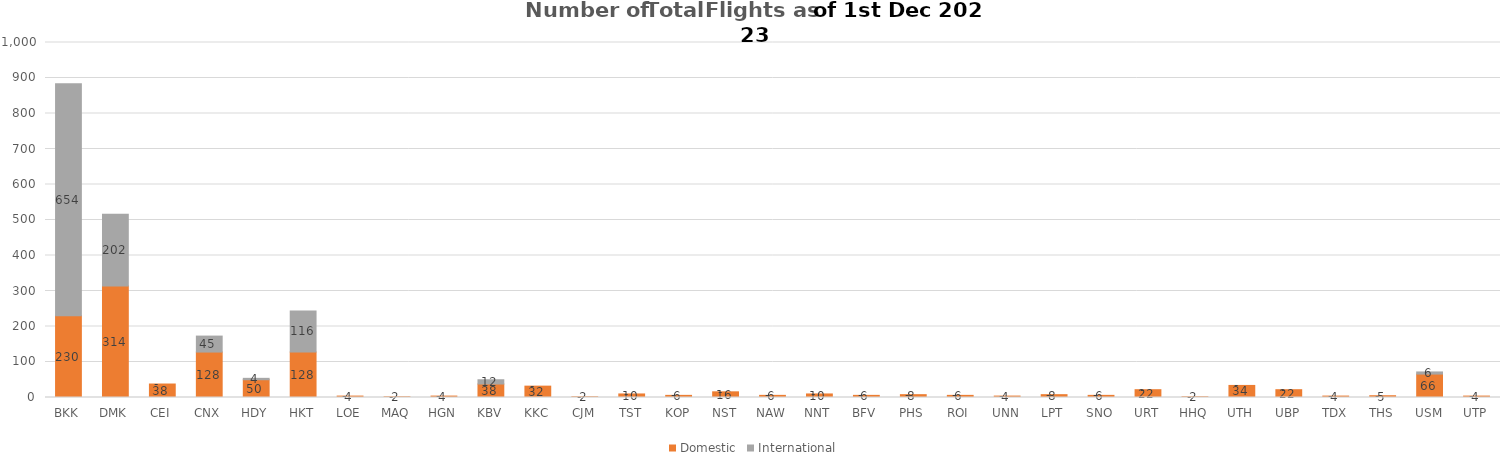
| Category | Domestic | International |
|---|---|---|
| BKK | 230 | 654 |
| DMK | 314 | 202 |
| CEI | 38 | 0 |
| CNX | 128 | 45 |
| HDY | 50 | 4 |
| HKT | 128 | 116 |
| LOE | 4 | 0 |
| MAQ | 2 | 0 |
| HGN | 4 | 0 |
| KBV | 38 | 12 |
| KKC | 32 | 0 |
| CJM | 2 | 0 |
| TST | 10 | 0 |
| KOP | 6 | 0 |
| NST | 16 | 0 |
| NAW | 6 | 0 |
| NNT | 10 | 0 |
| BFV | 6 | 0 |
| PHS | 8 | 0 |
| ROI | 6 | 0 |
| UNN | 4 | 0 |
| LPT | 8 | 0 |
| SNO | 6 | 0 |
| URT | 22 | 0 |
| HHQ | 2 | 0 |
| UTH | 34 | 0 |
| UBP | 22 | 0 |
| TDX | 4 | 0 |
| THS | 5 | 0 |
| USM | 66 | 6 |
| UTP | 4 | 0 |